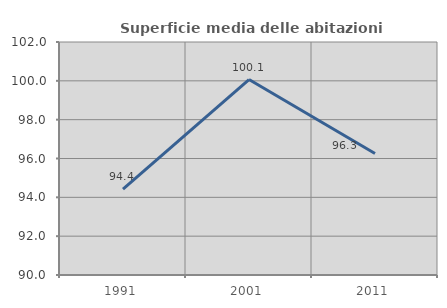
| Category | Superficie media delle abitazioni occupate |
|---|---|
| 1991.0 | 94.429 |
| 2001.0 | 100.066 |
| 2011.0 | 96.258 |